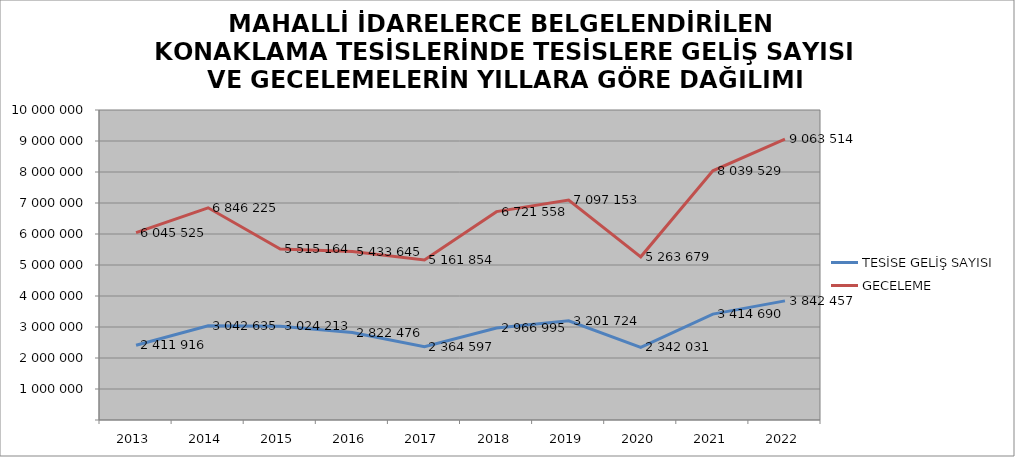
| Category | TESİSE GELİŞ SAYISI | GECELEME |
|---|---|---|
| 2013 | 2411916 | 6045525 |
| 2014 | 3042635 | 6846225 |
| 2015 | 3024213 | 5515164 |
| 2016 | 2822476 | 5433645 |
| 2017 | 2364597 | 5161854 |
| 2018 | 2966995 | 6721558 |
| 2019 | 3201724 | 7097153 |
| 2020 | 2342031 | 5263679 |
| 2021 | 3414690 | 8039529 |
| 2022 | 3842457 | 9063514 |